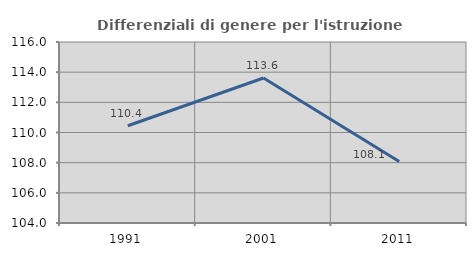
| Category | Differenziali di genere per l'istruzione superiore |
|---|---|
| 1991.0 | 110.448 |
| 2001.0 | 113.616 |
| 2011.0 | 108.083 |